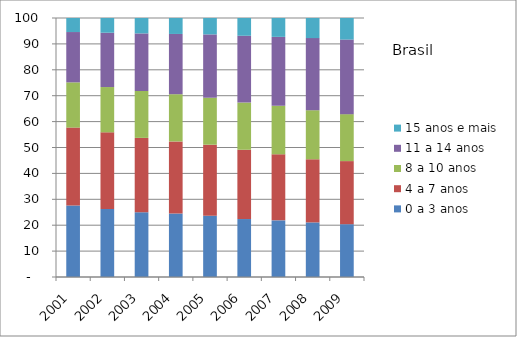
| Category | 0 a 3 anos | 4 a 7 anos | 8 a 10 anos | 11 a 14 anos | 15 anos e mais |
|---|---|---|---|---|---|
| 2001.0 | 27.57 | 30.12 | 17.46 | 19.43 | 5.43 |
| 2002.0 | 26.22 | 29.63 | 17.49 | 20.97 | 5.69 |
| 2003.0 | 25.04 | 28.67 | 18.11 | 22.23 | 5.95 |
| 2004.0 | 24.51 | 27.83 | 18.24 | 23.26 | 6.16 |
| 2005.0 | 23.64 | 27.44 | 18.14 | 24.45 | 6.33 |
| 2006.0 | 22.38 | 26.75 | 18.23 | 25.78 | 6.86 |
| 2007.0 | 21.87 | 25.5 | 18.73 | 26.61 | 7.3 |
| 2008.0 | 21.08 | 24.38 | 18.94 | 27.83 | 7.77 |
| 2009.0 | 20.39 | 24.36 | 18.13 | 28.79 | 8.33 |